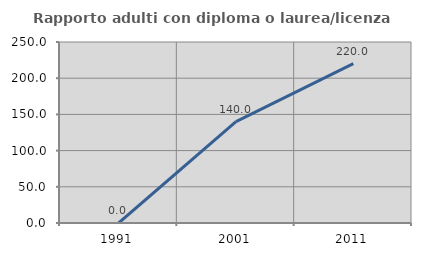
| Category | Rapporto adulti con diploma o laurea/licenza media  |
|---|---|
| 1991.0 | 0 |
| 2001.0 | 140 |
| 2011.0 | 220 |